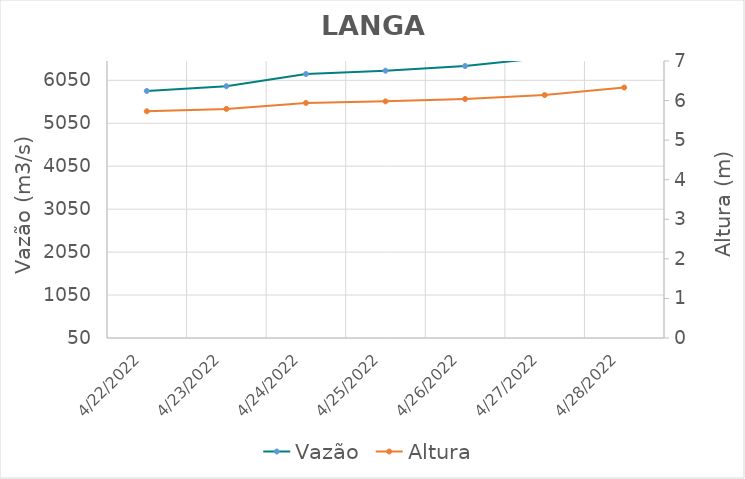
| Category | Vazão |
|---|---|
| 4/26/22 | 6357.44 |
| 4/25/22 | 6275.1 |
| 4/24/22 | 6196.88 |
| 4/23/22 | 5912.5 |
| 4/22/22 | 5801.88 |
| 4/21/22 | 4763.75 |
| 4/20/22 | 4718.96 |